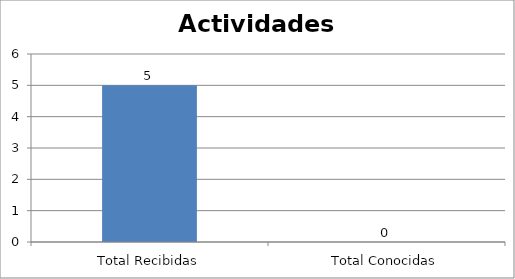
| Category | Series 0 |
|---|---|
| Total Recibidas | 5 |
| Total Conocidas | 0 |